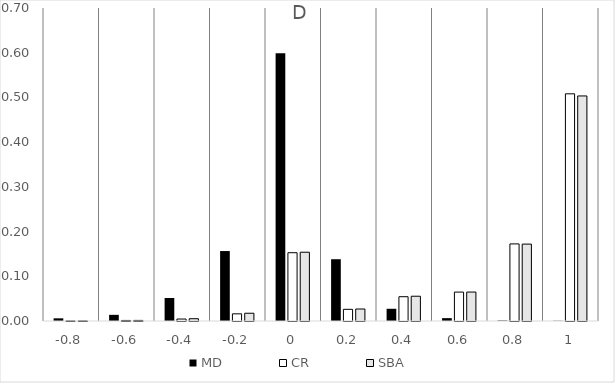
| Category | MD | CR | SBA |
|---|---|---|---|
| -0.8 | 0.006 | 0 | 0 |
| -0.6 | 0.014 | 0.001 | 0.001 |
| -0.4 | 0.051 | 0.004 | 0.005 |
| -0.2 | 0.156 | 0.016 | 0.017 |
| 0.0 | 0.599 | 0.153 | 0.154 |
| 0.2 | 0.138 | 0.026 | 0.027 |
| 0.4 | 0.027 | 0.054 | 0.055 |
| 0.6 | 0.006 | 0.065 | 0.065 |
| 0.8 | 0.001 | 0.172 | 0.172 |
| 1.0 | 0.001 | 0.508 | 0.503 |